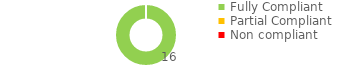
| Category | Series 0 |
|---|---|
| Fully Compliant | 16 |
| Partial Compliant | 0 |
| Non compliant | 0 |